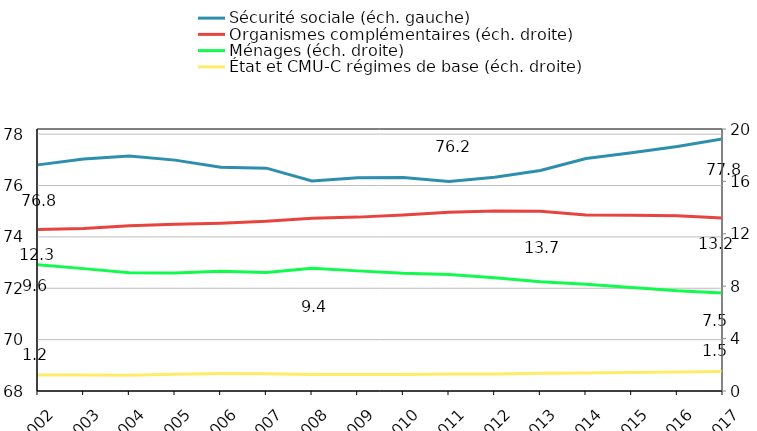
| Category | Sécurité sociale (éch. gauche) |
|---|---|
| 2002.0 | 76.803 |
| 2003.0 | 77.03 |
| 2004.0 | 77.146 |
| 2005.0 | 76.988 |
| 2006.0 | 76.714 |
| 2007.0 | 76.676 |
| 2008.0 | 76.176 |
| 2009.0 | 76.3 |
| 2010.0 | 76.309 |
| 2011.0 | 76.156 |
| 2012.0 | 76.319 |
| 2013.0 | 76.583 |
| 2014.0 | 77.052 |
| 2015.0 | 77.271 |
| 2016.0 | 77.519 |
| 2017.0 | 77.821 |